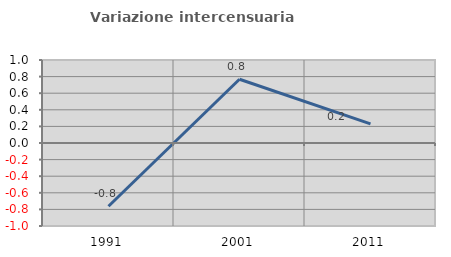
| Category | Variazione intercensuaria annua |
|---|---|
| 1991.0 | -0.762 |
| 2001.0 | 0.768 |
| 2011.0 | 0.23 |